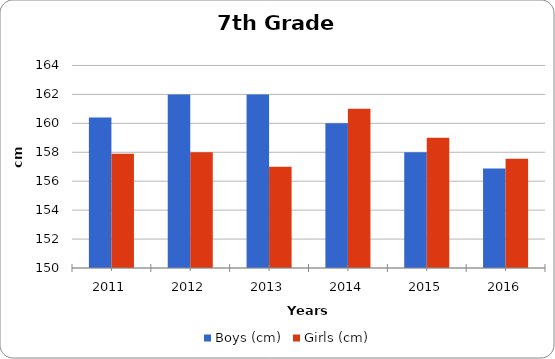
| Category | Boys (cm) | Girls (cm) |
|---|---|---|
| 2011.0 | 160.4 | 157.9 |
| 2012.0 | 162 | 158 |
| 2013.0 | 162 | 157 |
| 2014.0 | 160 | 161 |
| 2015.0 | 158 | 159 |
| 2016.0 | 156.885 | 157.559 |